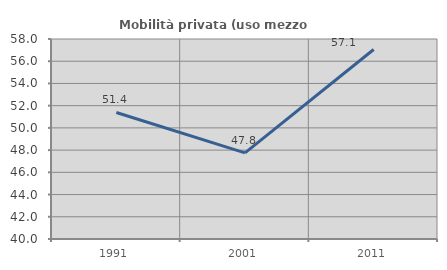
| Category | Mobilità privata (uso mezzo privato) |
|---|---|
| 1991.0 | 51.389 |
| 2001.0 | 47.755 |
| 2011.0 | 57.059 |